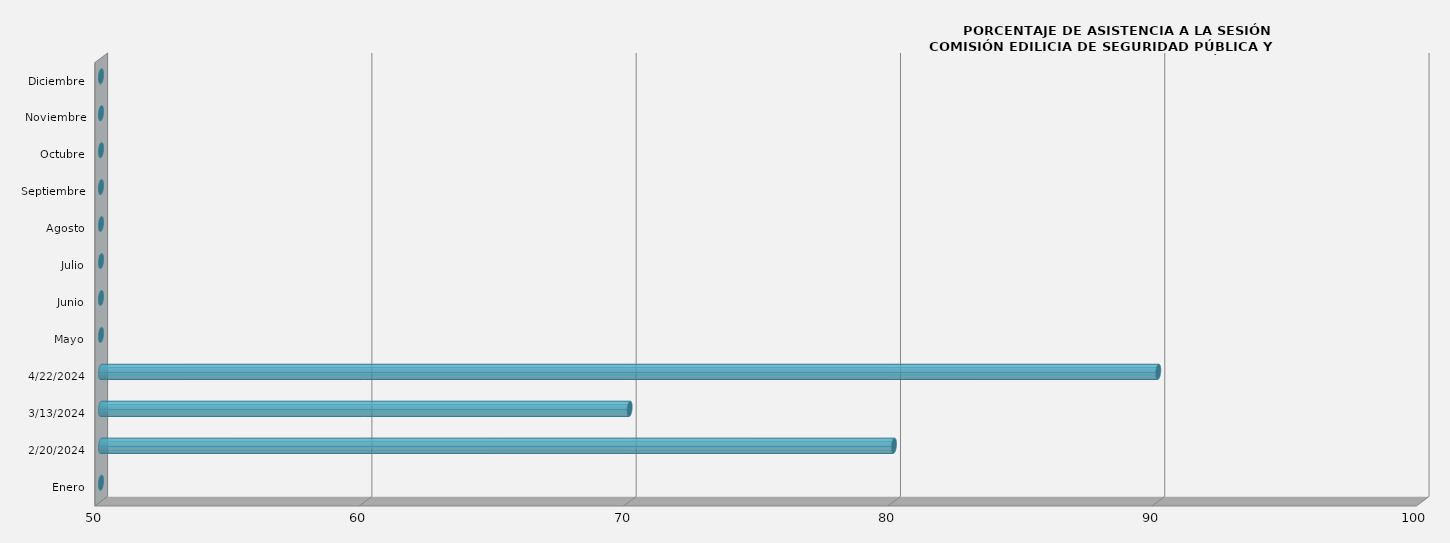
| Category | Enero |
|---|---|
| Enero | 0 |
| 20/02/2024 | 80 |
| 13/03/2024 | 70 |
| 22/04/2024 | 90 |
| Mayo | 0 |
| Junio | 0 |
| Julio | 0 |
| Agosto | 0 |
| Septiembre | 0 |
| Octubre | 0 |
| Noviembre | 0 |
| Diciembre | 0 |